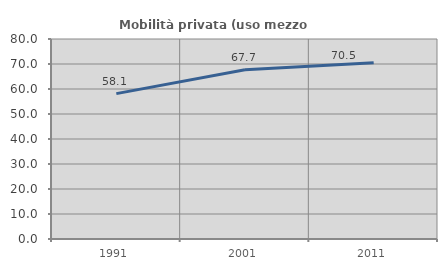
| Category | Mobilità privata (uso mezzo privato) |
|---|---|
| 1991.0 | 58.142 |
| 2001.0 | 67.74 |
| 2011.0 | 70.517 |